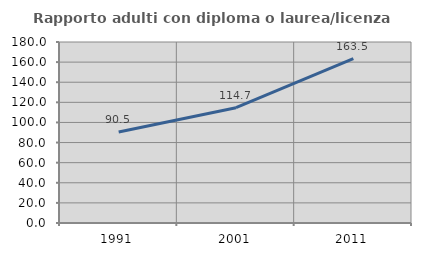
| Category | Rapporto adulti con diploma o laurea/licenza media  |
|---|---|
| 1991.0 | 90.454 |
| 2001.0 | 114.691 |
| 2011.0 | 163.487 |